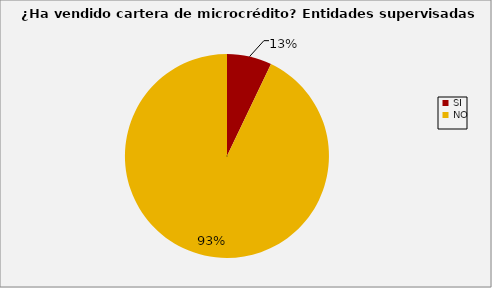
| Category | Series 0 |
|---|---|
| SI | 0.071 |
| NO | 0.929 |